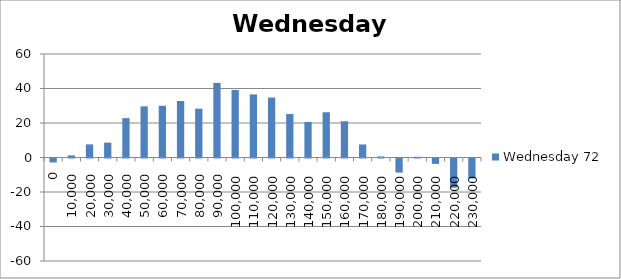
| Category | Wednesday 72 |
|---|---|
| 0.0 | -2.295 |
| 10000.0 | 1.215 |
| 20000.0 | 7.61 |
| 30000.0 | 8.615 |
| 40000.0 | 22.82 |
| 50000.0 | 29.655 |
| 60000.0 | 30 |
| 70000.0 | 32.77 |
| 80000.0 | 28.32 |
| 90000.0 | 43.26 |
| 100000.0 | 39.125 |
| 110000.0 | 36.555 |
| 120000.0 | 34.745 |
| 130000.0 | 25.225 |
| 140000.0 | 20.615 |
| 150000.0 | 26.23 |
| 160000.0 | 21.01 |
| 170000.0 | 7.555 |
| 180000.0 | 0.605 |
| 190000.0 | -8.145 |
| 200000.0 | 0.41 |
| 210000.0 | -3.12 |
| 220000.0 | -16.954 |
| 230000.0 | -11.575 |